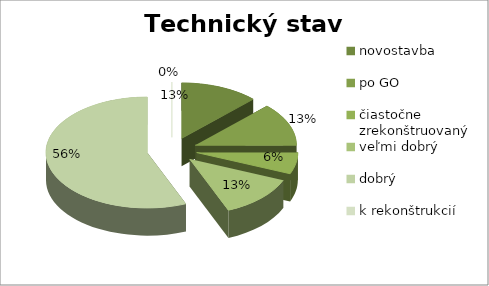
| Category | Technický stav obchodov |
|---|---|
| novostavba | 2 |
| po GO | 2 |
| čiastočne zrekonštruovaný | 1 |
| veľmi dobrý | 2 |
| dobrý | 9 |
| k rekonštrukcií | 0 |